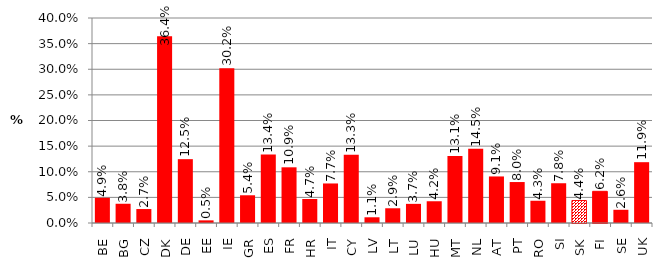
| Category | Series 0 |
|---|---|
| BE | 0.049 |
| BG | 0.038 |
| CZ | 0.027 |
| DK | 0.364 |
| DE | 0.125 |
| EE | 0.005 |
| IE | 0.302 |
| GR | 0.054 |
| ES | 0.134 |
| FR | 0.109 |
| HR | 0.047 |
| IT | 0.077 |
| CY | 0.133 |
| LV | 0.011 |
| LT | 0.029 |
| LU | 0.037 |
| HU | 0.042 |
| MT | 0.131 |
| NL | 0.145 |
| AT | 0.091 |
| PT | 0.08 |
| RO | 0.043 |
| SI | 0.078 |
| SK | 0.044 |
| FI | 0.062 |
| SE | 0.026 |
| UK | 0.119 |